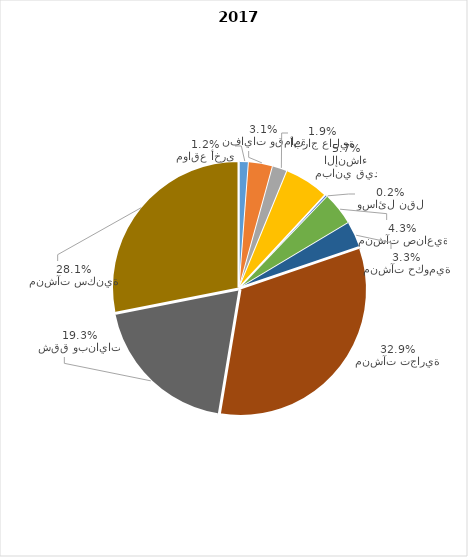
| Category | Series 0 |
|---|---|
| مواقع أخرى | 5 |
| نفايات وقمامة | 13 |
| أبراج عالية | 8 |
| مباني قيد الإنشاء | 24 |
| وسائل نقل | 1 |
| منشآت صناعية | 18 |
| منشآت حكومية | 14 |
| منشآت تجارية | 138 |
| شقق وبنايات | 81 |
| منشآت سكنية | 118 |